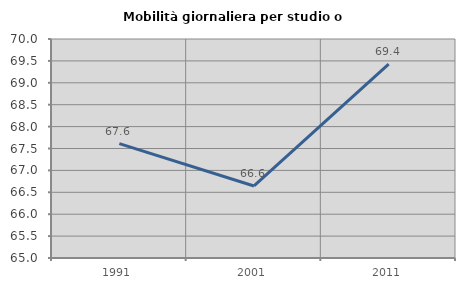
| Category | Mobilità giornaliera per studio o lavoro |
|---|---|
| 1991.0 | 67.613 |
| 2001.0 | 66.645 |
| 2011.0 | 69.429 |